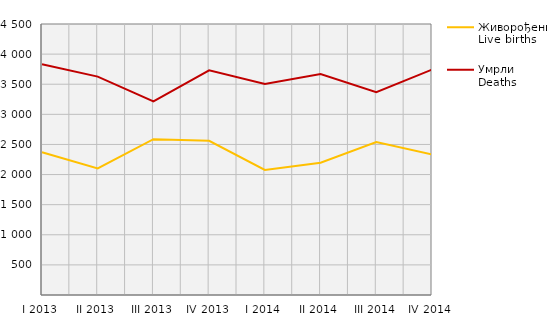
| Category | Живорођени
Live births | Умрли
Deaths |
|---|---|---|
| I 2013 | 2369 | 3833 |
| II 2013 | 2102 | 3626 |
| III 2013 | 2587 | 3214 |
| IV 2013 | 2561 | 3730 |
| I 2014 | 2076 | 3505 |
| II 2014 | 2197 | 3669 |
| III 2014 | 2540 | 3367 |
| IV 2014 | 2332 | 3743 |